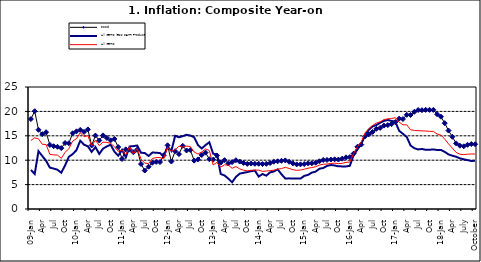
| Category | Food | All Items less Farm Produce | All Items |
|---|---|---|---|
| 09-Jan | 18.436 | 8.013 | 14.034 |
| Feb | 20.041 | 7.178 | 14.584 |
| Mar | 16.233 | 11.842 | 14.366 |
| Apr | 15.342 | 10.85 | 13.268 |
| May | 15.74 | 9.88 | 13.212 |
| June | 13.138 | 8.472 | 11.194 |
| Jul | 12.867 | 8.285 | 11.09 |
| Aug | 12.746 | 8.044 | 11.046 |
| Sep | 12.472 | 7.431 | 10.39 |
| Oct | 13.524 | 8.933 | 11.588 |
| Nov | 13.482 | 10.702 | 12.368 |
| Dec | 15.518 | 11.249 | 13.93 |
| 10-Jan | 15.918 | 12.063 | 14.398 |
| Feb | 16.208 | 13.978 | 15.649 |
| Mar | 15.79 | 13.184 | 14.812 |
| Apr | 16.306 | 12.844 | 15.044 |
| May | 13.023 | 11.711 | 12.915 |
| Jun | 15.053 | 12.686 | 14.099 |
| Jul | 14.043 | 11.287 | 13.002 |
| Aug | 15.09 | 12.366 | 13.702 |
| Sep | 14.57 | 12.83 | 13.65 |
| Oct | 14.065 | 13.168 | 13.45 |
| Nov | 14.351 | 11.746 | 12.766 |
| Dec | 12.701 | 10.917 | 11.815 |
| 11-Jan | 10.255 | 12.118 | 12.08 |
| Feb | 12.221 | 10.569 | 11.1 |
| Mar | 12.169 | 12.815 | 12.779 |
| Apr | 11.629 | 12.882 | 11.291 |
| May | 12.179 | 13.006 | 12.352 |
| Jun | 9.22 | 11.524 | 10.23 |
| Jul | 7.877 | 11.472 | 9.397 |
| Aug | 8.665 | 10.863 | 9.301 |
| Sep | 9.479 | 11.567 | 10.339 |
| Oct | 9.656 | 11.539 | 10.544 |
| Nov | 9.623 | 11.459 | 10.54 |
| Dec | 11.02 | 10.822 | 10.283 |
| 12-Jan | 13.053 | 12.748 | 12.626 |
| 12-Feb | 9.729 | 11.901 | 11.866 |
| 12-Mar | 11.848 | 14.995 | 12.111 |
| Apr | 11.246 | 14.703 | 12.866 |
| May | 12.942 | 14.926 | 12.688 |
| Jun | 11.991 | 15.199 | 12.892 |
| Jul | 12.093 | 15.045 | 12.797 |
| Aug | 9.91 | 14.714 | 11.689 |
| Sep | 10.164 | 13.101 | 11.253 |
| Oct | 11.064 | 12.398 | 11.693 |
| Nov | 11.553 | 13.092 | 12.32 |
| Dec | 10.199 | 13.685 | 11.981 |
| 13-Jan | 10.106 | 11.342 | 9.031 |
| Feb | 10.973 | 11.184 | 9.542 |
| Mar | 9.482 | 7.179 | 8.593 |
| Apr | 10.006 | 6.874 | 9.052 |
| May | 9.321 | 6.227 | 8.964 |
| Jun | 9.606 | 5.472 | 8.353 |
| Jul | 9.994 | 6.58 | 8.682 |
| Aug | 9.723 | 7.245 | 8.231 |
| Sep | 9.437 | 7.41 | 7.952 |
| Oct | 9.249 | 7.579 | 7.807 |
| Nov | 9.313 | 7.75 | 7.931 |
| Dec | 9.253 | 7.872 | 7.957 |
| 14-Jan | 9.271 | 6.648 | 7.977 |
| Feb | 9.207 | 7.166 | 7.707 |
| Mar | 9.254 | 6.836 | 7.783 |
| Apr | 9.414 | 7.508 | 7.851 |
| May | 9.698 | 7.693 | 7.965 |
| Jun | 9.776 | 8.122 | 8.167 |
| Jul | 9.878 | 7.116 | 8.281 |
| Aug | 9.959 | 6.264 | 8.534 |
| Sep | 9.676 | 6.278 | 8.317 |
| Oct | 9.343 | 6.252 | 8.06 |
| Nov | 9.144 | 6.255 | 7.927 |
| Dec | 9.152 | 6.225 | 7.978 |
| 15-Jan | 9.215 | 6.787 | 8.157 |
| Feb | 9.359 | 6.994 | 8.359 |
| Mar | 9.376 | 7.46 | 8.494 |
| Apr | 9.49 | 7.661 | 8.655 |
| May | 9.782 | 8.253 | 9.003 |
| Jun | 10.041 | 8.403 | 9.168 |
| Jul | 10.049 | 8.83 | 9.218 |
| Aug | 10.131 | 9.01 | 9.336 |
| Sep | 10.174 | 8.928 | 9.394 |
| Oct | 10.129 | 8.742 | 9.296 |
| Nov | 10.321 | 8.732 | 9.368 |
| Dec | 10.588 | 8.727 | 9.554 |
| 16-Jan | 10.642 | 8.841 | 9.617 |
| Feb | 11.348 | 11.041 | 11.379 |
| Mar | 12.745 | 12.17 | 12.775 |
| Apr | 13.194 | 13.352 | 13.721 |
| May | 14.861 | 15.054 | 15.577 |
| Jun | 15.302 | 16.224 | 16.48 |
| Jul | 15.799 | 16.929 | 17.127 |
| Aug | 16.427 | 17.208 | 17.609 |
| Sep | 16.622 | 17.666 | 17.852 |
| Oct | 17.09 | 18.067 | 18.33 |
| Nov | 17.191 | 18.241 | 18.476 |
| Dec | 17.388 | 18.052 | 18.547 |
| 17-Jan | 17.818 | 17.867 | 18.719 |
| Feb | 18.528 | 16.011 | 17.78 |
| Mar | 18.436 | 15.404 | 17.256 |
| Apr | 19.303 | 14.75 | 17.244 |
| May | 19.266 | 13.016 | 16.251 |
| Jun | 19.915 | 12.455 | 16.098 |
| Jul | 20.284 | 12.207 | 16.053 |
| Aug | 20.251 | 12.296 | 16.012 |
| Sep | 20.321 | 12.123 | 15.979 |
| Oct | 20.306 | 12.142 | 15.905 |
| Nov | 20.308 | 12.206 | 15.901 |
| Dec | 19.415 | 12.089 | 15.372 |
| 18-Jan | 18.919 | 12.09 | 15.127 |
| Feb | 17.588 | 11.707 | 14.33 |
| Mar | 16.08 | 11.181 | 13.337 |
| Apr | 14.799 | 10.92 | 12.482 |
| May | 13.448 | 10.71 | 11.608 |
| June | 12.977 | 10.387 | 11.231 |
| July | 12.85 | 10.183 | 11.142 |
| August | 13.158 | 10.015 | 11.227 |
| September | 13.309 | 9.838 | 11.284 |
| October | 13.277 | 9.882 | 11.259 |